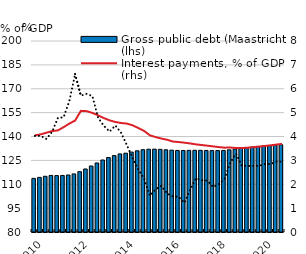
| Category | Gross public debt (Maastricht) (lhs) |
|---|---|
| nan | 113.687 |
| nan | 114.317 |
| 2010.0 | 115.003 |
| nan | 115.537 |
| nan | 115.454 |
| nan | 115.531 |
| nan | 115.806 |
| nan | 116.486 |
| nan | 117.895 |
| nan | 119.596 |
| 2012.0 | 121.448 |
| nan | 123.365 |
| nan | 125.235 |
| nan | 126.787 |
| nan | 128.013 |
| nan | 129.051 |
| nan | 129.514 |
| nan | 130.227 |
| 2014.0 | 131.021 |
| nan | 131.713 |
| nan | 132.01 |
| nan | 132.064 |
| nan | 131.939 |
| nan | 131.647 |
| nan | 131.418 |
| nan | 131.254 |
| 2016.0 | 131.208 |
| nan | 131.294 |
| nan | 131.344 |
| nan | 131.321 |
| nan | 131.241 |
| nan | 131.136 |
| nan | 131.183 |
| nan | 131.254 |
| 2018.0 | 131.632 |
| nan | 132.112 |
| nan | 132.534 |
| nan | 133.043 |
| nan | 133.385 |
| nan | 133.751 |
| nan | 134.013 |
| nan | 134.284 |
| 2020.0 | 134.558 |
| nan | 134.82 |